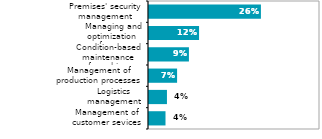
| Category | Series 0 |
|---|---|
| Management of customer sevices | 0.039 |
| Logistics management | 0.042 |
| Management of production processes | 0.066 |
| Condition-based maintenance 
of machines  | 0.093 |
| Managing and optimization 
of energy consumption | 0.117 |
| Premises' security management | 0.262 |